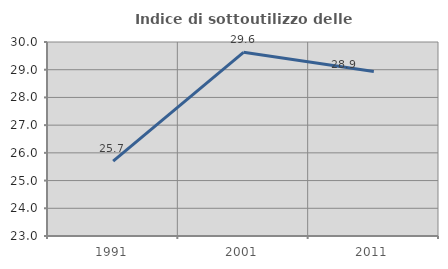
| Category | Indice di sottoutilizzo delle abitazioni  |
|---|---|
| 1991.0 | 25.701 |
| 2001.0 | 29.629 |
| 2011.0 | 28.935 |